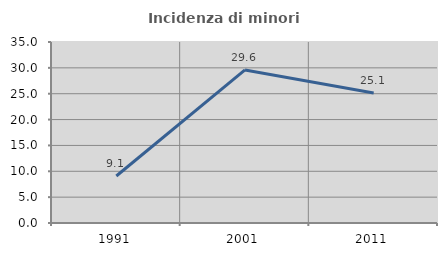
| Category | Incidenza di minori stranieri |
|---|---|
| 1991.0 | 9.091 |
| 2001.0 | 29.596 |
| 2011.0 | 25.122 |